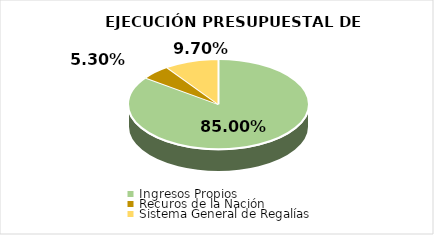
| Category | Series 0 |
|---|---|
| Ingresos Propios | 0.85 |
| Recuros de la Nación | 0.053 |
| Sistema General de Regalías | 0.097 |